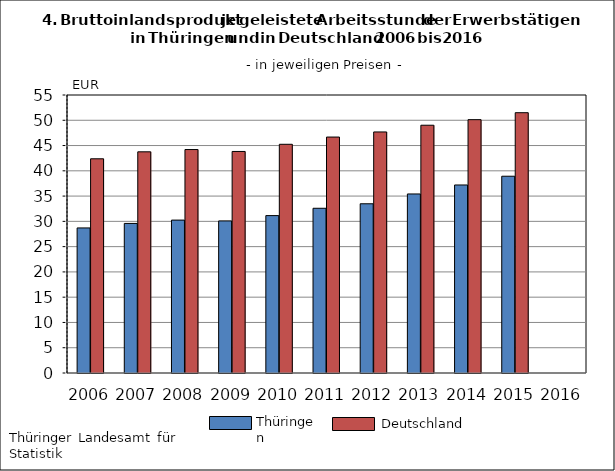
| Category | Series 0 | Series 1 |
|---|---|---|
| 2006.0 | 28.7 | 42.38 |
| 2007.0 | 29.59 | 43.76 |
| 2008.0 | 30.25 | 44.21 |
| 2009.0 | 30.09 | 43.83 |
| 2010.0 | 31.14 | 45.25 |
| 2011.0 | 32.59 | 46.68 |
| 2012.0 | 33.48 | 47.69 |
| 2013.0 | 35.42 | 49.02 |
| 2014.0 | 37.2 | 50.12 |
| 2015.0 | 38.93 | 51.5 |
| 2016.0 | 0 | 0 |